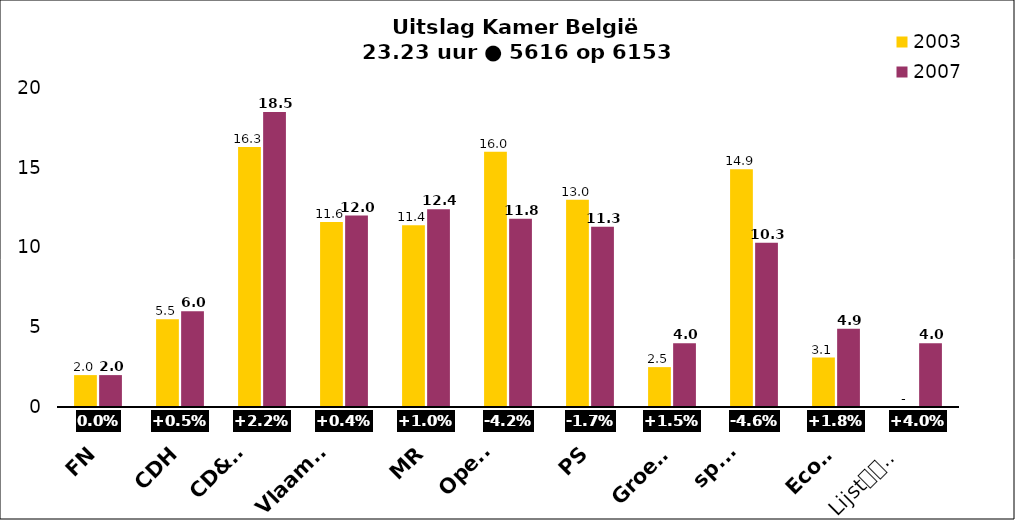
| Category | 2003 | 2007 |
|---|---|---|
| FN | 2 | 2 |
| CDH | 5.5 | 6 |
| CD&V
N-VA | 16.3 | 18.5 |
| Vlaams
Belang | 11.6 | 12 |
| MR | 11.4 | 12.4 |
| Open
VLD | 16 | 11.8 |
| PS | 13 | 11.3 |
| Groen! | 2.5 | 4 |
| sp.a
Spirit | 14.9 | 10.3 |
| Ecolo | 3.1 | 4.9 |
| Lijst
Dedecker | 0 | 4 |